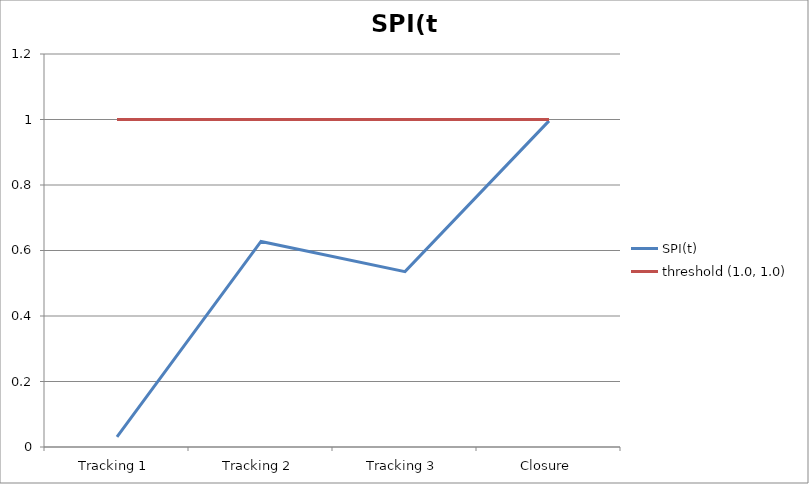
| Category | SPI(t) | threshold (1.0, 1.0) |
|---|---|---|
| Tracking 1 | 0.031 | 1 |
| Tracking 2 | 0.628 | 1 |
| Tracking 3 | 0.535 | 1 |
| Closure | 0.996 | 1 |